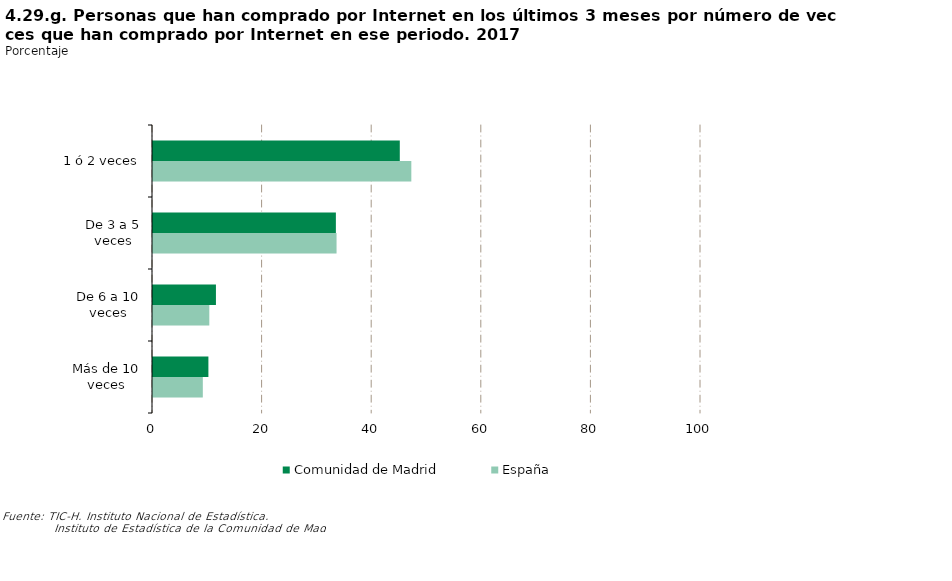
| Category | Comunidad de Madrid | España |
|---|---|---|
| 1 ó 2 veces | 45.035 | 47.139 |
| De 3 a 5 veces | 33.372 | 33.494 |
| De 6 a 10 veces | 11.484 | 10.277 |
| Más de 10 veces | 10.11 | 9.09 |